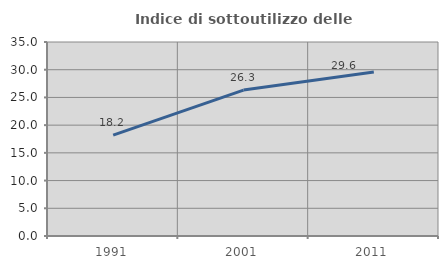
| Category | Indice di sottoutilizzo delle abitazioni  |
|---|---|
| 1991.0 | 18.185 |
| 2001.0 | 26.33 |
| 2011.0 | 29.571 |